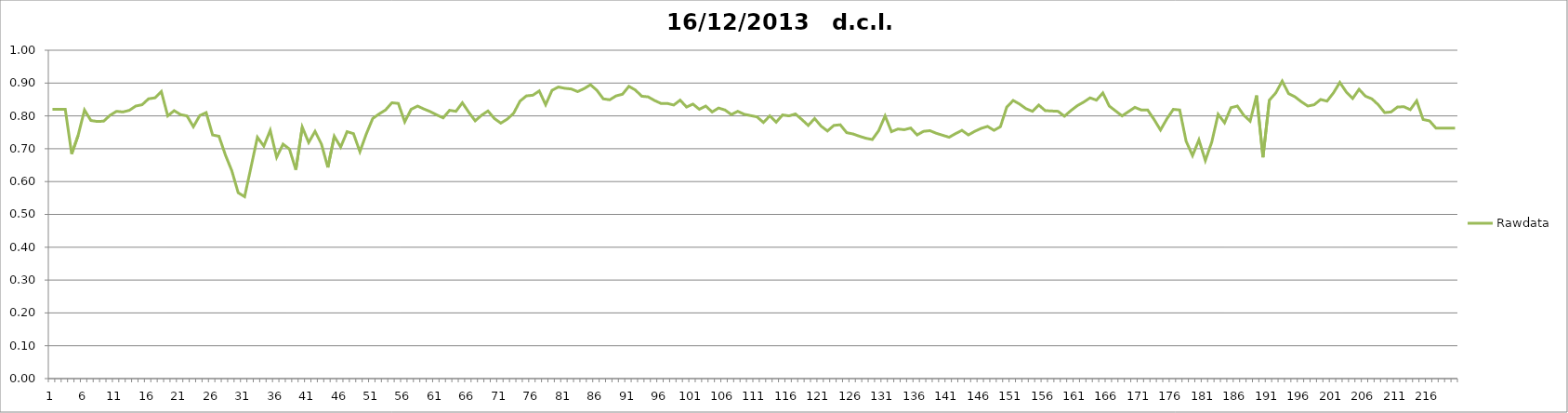
| Category | Rawdata |
|---|---|
| 0 | 0.82 |
| 1 | 0.82 |
| 2 | 0.82 |
| 3 | 0.684 |
| 4 | 0.74 |
| 5 | 0.818 |
| 6 | 0.786 |
| 7 | 0.783 |
| 8 | 0.784 |
| 9 | 0.802 |
| 10 | 0.814 |
| 11 | 0.812 |
| 12 | 0.817 |
| 13 | 0.83 |
| 14 | 0.834 |
| 15 | 0.852 |
| 16 | 0.855 |
| 17 | 0.874 |
| 18 | 0.8 |
| 19 | 0.816 |
| 20 | 0.804 |
| 21 | 0.8 |
| 22 | 0.767 |
| 23 | 0.801 |
| 24 | 0.81 |
| 25 | 0.742 |
| 26 | 0.738 |
| 27 | 0.681 |
| 28 | 0.633 |
| 29 | 0.566 |
| 30 | 0.554 |
| 31 | 0.644 |
| 32 | 0.735 |
| 33 | 0.708 |
| 34 | 0.756 |
| 35 | 0.674 |
| 36 | 0.714 |
| 37 | 0.699 |
| 38 | 0.636 |
| 39 | 0.766 |
| 40 | 0.719 |
| 41 | 0.753 |
| 42 | 0.714 |
| 43 | 0.643 |
| 44 | 0.738 |
| 45 | 0.705 |
| 46 | 0.752 |
| 47 | 0.746 |
| 48 | 0.691 |
| 49 | 0.745 |
| 50 | 0.792 |
| 51 | 0.806 |
| 52 | 0.818 |
| 53 | 0.84 |
| 54 | 0.838 |
| 55 | 0.782 |
| 56 | 0.82 |
| 57 | 0.83 |
| 58 | 0.821 |
| 59 | 0.813 |
| 60 | 0.803 |
| 61 | 0.794 |
| 62 | 0.817 |
| 63 | 0.814 |
| 64 | 0.84 |
| 65 | 0.811 |
| 66 | 0.785 |
| 67 | 0.802 |
| 68 | 0.815 |
| 69 | 0.792 |
| 70 | 0.778 |
| 71 | 0.79 |
| 72 | 0.808 |
| 73 | 0.845 |
| 74 | 0.861 |
| 75 | 0.863 |
| 76 | 0.876 |
| 77 | 0.834 |
| 78 | 0.878 |
| 79 | 0.888 |
| 80 | 0.884 |
| 81 | 0.882 |
| 82 | 0.874 |
| 83 | 0.883 |
| 84 | 0.895 |
| 85 | 0.878 |
| 86 | 0.852 |
| 87 | 0.849 |
| 88 | 0.861 |
| 89 | 0.866 |
| 90 | 0.89 |
| 91 | 0.879 |
| 92 | 0.86 |
| 93 | 0.858 |
| 94 | 0.847 |
| 95 | 0.838 |
| 96 | 0.838 |
| 97 | 0.833 |
| 98 | 0.848 |
| 99 | 0.827 |
| 100 | 0.836 |
| 101 | 0.82 |
| 102 | 0.83 |
| 103 | 0.812 |
| 104 | 0.824 |
| 105 | 0.818 |
| 106 | 0.804 |
| 107 | 0.814 |
| 108 | 0.805 |
| 109 | 0.801 |
| 110 | 0.797 |
| 111 | 0.78 |
| 112 | 0.8 |
| 113 | 0.781 |
| 114 | 0.803 |
| 115 | 0.8 |
| 116 | 0.806 |
| 117 | 0.789 |
| 118 | 0.771 |
| 119 | 0.792 |
| 120 | 0.769 |
| 121 | 0.754 |
| 122 | 0.771 |
| 123 | 0.773 |
| 124 | 0.749 |
| 125 | 0.745 |
| 126 | 0.738 |
| 127 | 0.732 |
| 128 | 0.728 |
| 129 | 0.755 |
| 130 | 0.8 |
| 131 | 0.752 |
| 132 | 0.76 |
| 133 | 0.758 |
| 134 | 0.763 |
| 135 | 0.742 |
| 136 | 0.753 |
| 137 | 0.755 |
| 138 | 0.747 |
| 139 | 0.741 |
| 140 | 0.735 |
| 141 | 0.746 |
| 142 | 0.756 |
| 143 | 0.742 |
| 144 | 0.753 |
| 145 | 0.762 |
| 146 | 0.768 |
| 147 | 0.756 |
| 148 | 0.767 |
| 149 | 0.827 |
| 150 | 0.847 |
| 151 | 0.836 |
| 152 | 0.822 |
| 153 | 0.814 |
| 154 | 0.833 |
| 155 | 0.816 |
| 156 | 0.815 |
| 157 | 0.814 |
| 158 | 0.799 |
| 159 | 0.816 |
| 160 | 0.831 |
| 161 | 0.842 |
| 162 | 0.855 |
| 163 | 0.848 |
| 164 | 0.87 |
| 165 | 0.83 |
| 166 | 0.815 |
| 167 | 0.8 |
| 168 | 0.813 |
| 169 | 0.826 |
| 170 | 0.818 |
| 171 | 0.818 |
| 172 | 0.789 |
| 173 | 0.757 |
| 174 | 0.791 |
| 175 | 0.82 |
| 176 | 0.818 |
| 177 | 0.723 |
| 178 | 0.679 |
| 179 | 0.727 |
| 180 | 0.664 |
| 181 | 0.72 |
| 182 | 0.805 |
| 183 | 0.779 |
| 184 | 0.825 |
| 185 | 0.83 |
| 186 | 0.802 |
| 187 | 0.784 |
| 188 | 0.862 |
| 189 | 0.674 |
| 190 | 0.848 |
| 191 | 0.87 |
| 192 | 0.906 |
| 193 | 0.868 |
| 194 | 0.858 |
| 195 | 0.843 |
| 196 | 0.83 |
| 197 | 0.834 |
| 198 | 0.85 |
| 199 | 0.845 |
| 200 | 0.87 |
| 201 | 0.902 |
| 202 | 0.873 |
| 203 | 0.853 |
| 204 | 0.881 |
| 205 | 0.86 |
| 206 | 0.852 |
| 207 | 0.834 |
| 208 | 0.81 |
| 209 | 0.812 |
| 210 | 0.827 |
| 211 | 0.828 |
| 212 | 0.819 |
| 213 | 0.846 |
| 214 | 0.789 |
| 215 | 0.785 |
| 216 | 0.763 |
| 217 | 0.763 |
| 218 | 0.763 |
| 219 | 0.763 |